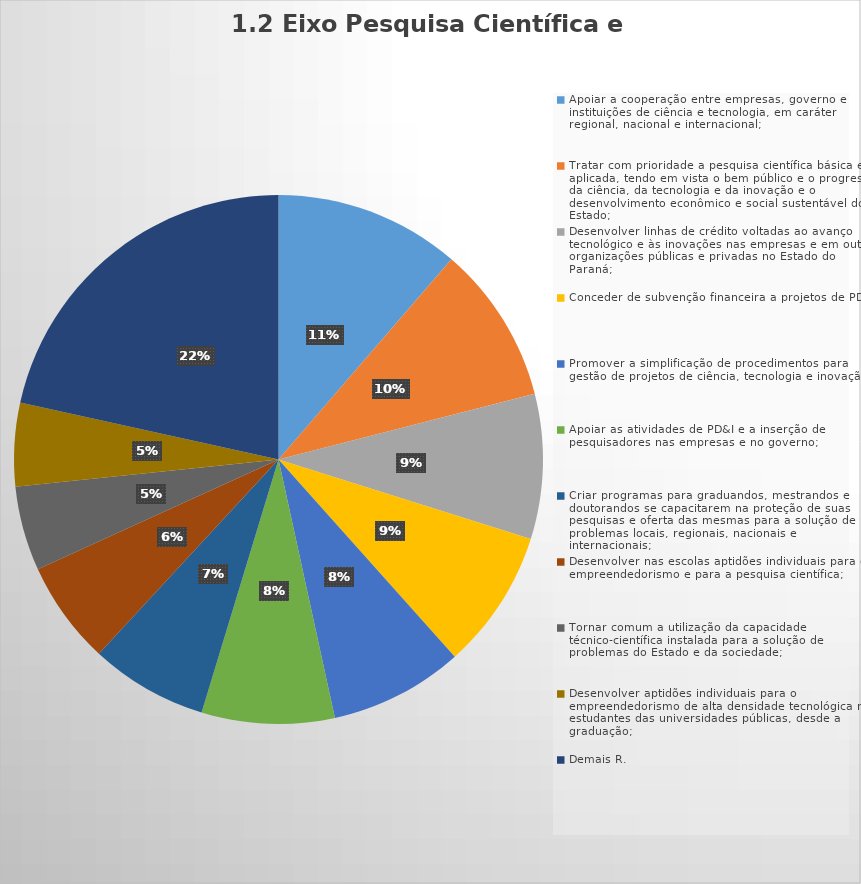
| Category | Series 0 |
|---|---|
| Apoiar a cooperação entre empresas, governo e instituições de ciência e tecnologia, em caráter regional, nacional e internacional; | 169 |
| Tratar com prioridade a pesquisa científica básica e aplicada, tendo em vista o bem público e o progresso da ciência, da tecnologia e da inovação e o desenvolvimento econômico e social sustentável do Estado; | 144 |
| Desenvolver linhas de crédito voltadas ao avanço tecnológico e às inovações nas empresas e em outras organizações públicas e privadas no Estado do Paraná; | 132 |
| Conceder de subvenção financeira a projetos de PD&I; | 127 |
| Promover a simplificação de procedimentos para gestão de projetos de ciência, tecnologia e inovação; | 122 |
| Apoiar as atividades de PD&I e a inserção de pesquisadores nas empresas e no governo; | 121 |
| Criar programas para graduandos, mestrandos e doutorandos se capacitarem na proteção de suas pesquisas e oferta das mesmas para a solução de problemas locais, regionais, nacionais e internacionais; | 107 |
| Desenvolver nas escolas aptidões individuais para o empreendedorismo e para a pesquisa científica; | 94 |
| Tornar comum a utilização da capacidade técnico-científica instalada para a solução de problemas do Estado e da sociedade; | 77 |
| Desenvolver aptidões individuais para o empreendedorismo de alta densidade tecnológica nos estudantes das universidades públicas, desde a graduação; | 76 |
| Demais R. | 321 |